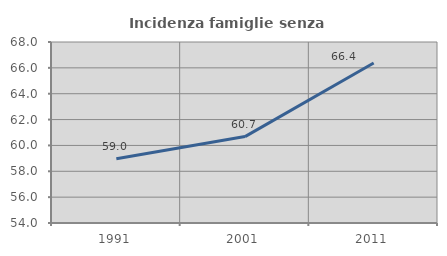
| Category | Incidenza famiglie senza nuclei |
|---|---|
| 1991.0 | 58.974 |
| 2001.0 | 60.684 |
| 2011.0 | 66.372 |